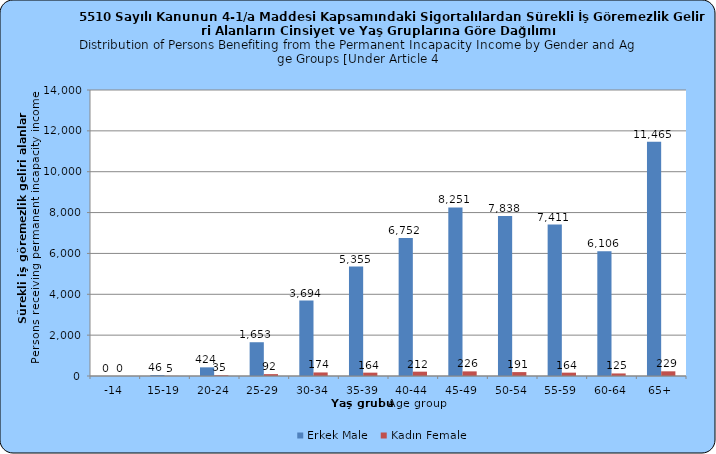
| Category | Erkek Male | Kadın Female |
|---|---|---|
| -14 | 0 | 0 |
| 15-19 | 46 | 5 |
| 20-24 | 424 | 35 |
| 25-29 | 1653 | 92 |
| 30-34 | 3694 | 174 |
| 35-39 | 5355 | 164 |
| 40-44 | 6752 | 212 |
| 45-49 | 8251 | 226 |
| 50-54 | 7838 | 191 |
| 55-59 | 7411 | 164 |
| 60-64 | 6106 | 125 |
| 65+ | 11465 | 229 |